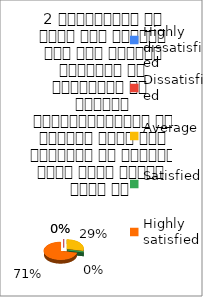
| Category | 2 व्याख्यान से रूचि में वृद्धि हुई एवं शिक्षण जानकारी से परिपूर्ण था 
शिक्षक विद्यार्थियों के द्वारा पूछे गये प्रश्नो का समाधान करने हेतु तत्पर  रहते है  |
|---|---|
| Highly dissatisfied | 0 |
| Dissatisfied | 0 |
| Average | 2 |
| Satisfied | 0 |
| Highly satisfied | 5 |